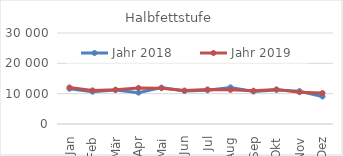
| Category | Jahr 2018 | Jahr 2019 |
|---|---|---|
| 0 | 11642.396 | 12043.161 |
| 1 | 10660.091 | 11082.093 |
| 2 | 11189.41 | 11326.84 |
| 3 | 10337.601 | 11897.457 |
| 4 | 11993.195 | 11803.776 |
| 5 | 10895.702 | 11019.073 |
| 6 | 11098.835 | 11404.895 |
| 7 | 12068.513 | 11262.453 |
| 8 | 10709.664 | 10972.547 |
| 9 | 11235.438 | 11412.172 |
| 10 | 10816.535 | 10475.138 |
| 11 | 9071.324 | 10199.499 |